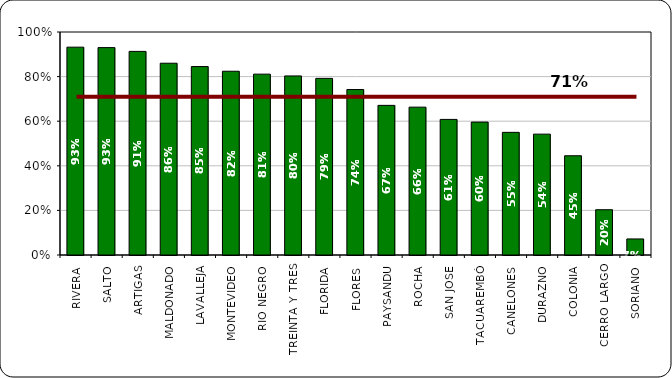
| Category | 2012 |
|---|---|
| RIVERA | 0.932 |
| SALTO | 0.93 |
| ARTIGAS | 0.913 |
| MALDONADO | 0.86 |
| LAVALLEJA | 0.845 |
| MONTEVIDEO | 0.824 |
| RIO NEGRO | 0.811 |
| TREINTA Y TRES | 0.803 |
| FLORIDA | 0.792 |
| FLORES | 0.742 |
| PAYSANDU | 0.671 |
| ROCHA | 0.663 |
| SAN JOSE | 0.608 |
| TACUAREMBÓ | 0.596 |
| CANELONES | 0.55 |
| DURAZNO | 0.542 |
| COLONIA | 0.445 |
| CERRO LARGO | 0.203 |
| SORIANO | 0.072 |